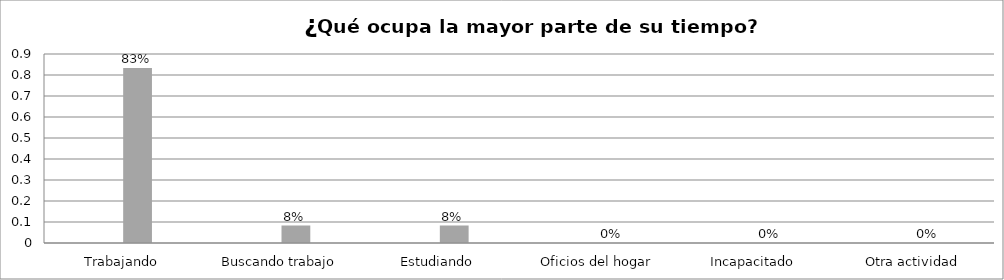
| Category | Series 0 | Series 1 | Series 2 | Series 3 |
|---|---|---|---|---|
| Trabajando |  |  | 0.833 |  |
| Buscando trabajo |  |  | 0.083 |  |
| Estudiando |  |  | 0.083 |  |
| Oficios del hogar |  |  | 0 |  |
| Incapacitado  |  |  | 0 |  |
| Otra actividad |  |  | 0 |  |